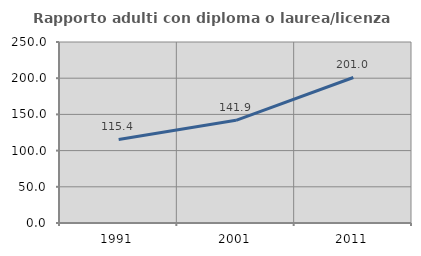
| Category | Rapporto adulti con diploma o laurea/licenza media  |
|---|---|
| 1991.0 | 115.361 |
| 2001.0 | 141.867 |
| 2011.0 | 201.014 |